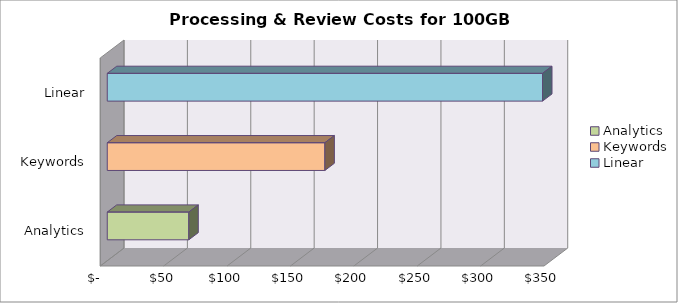
| Category | Series 0 |
|---|---|
| Analytics | 64333.333 |
| Keywords | 171666.667 |
| Linear | 343333.333 |